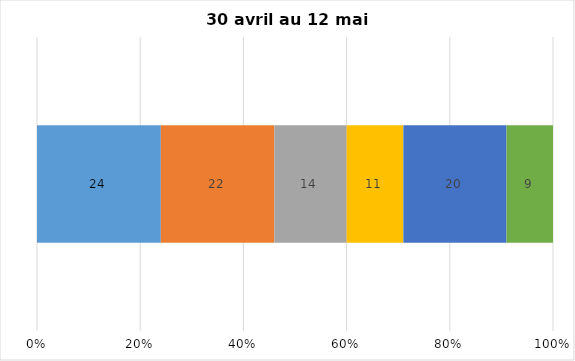
| Category | Plusieurs fois par jour | Une fois par jour | Quelques fois par semaine   | Une fois par semaine ou moins   |  Jamais   |  Je n’utilise pas les médias sociaux |
|---|---|---|---|---|---|---|
| 0 | 24 | 22 | 14 | 11 | 20 | 9 |